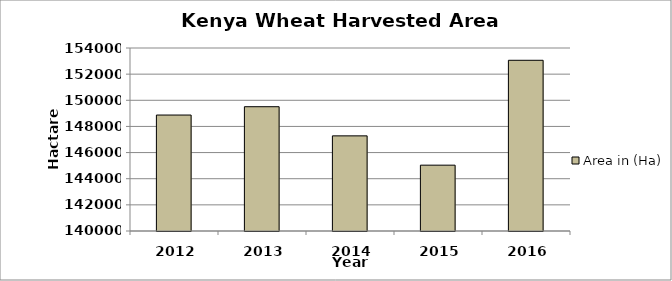
| Category | Area in (Ha) |
|---|---|
| 2012.0 | 148871 |
| 2013.0 | 149508 |
| 2014.0 | 147278 |
| 2015.0 | 145037 |
| 2016.0 | 153060 |